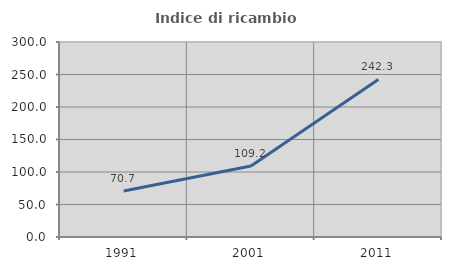
| Category | Indice di ricambio occupazionale  |
|---|---|
| 1991.0 | 70.696 |
| 2001.0 | 109.152 |
| 2011.0 | 242.318 |